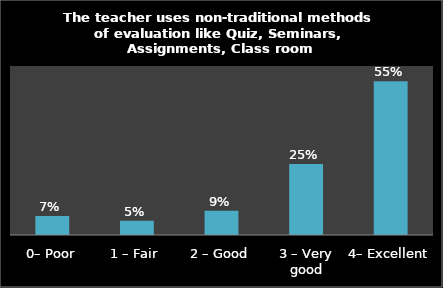
| Category | Series 0 |
|---|---|
| 0– Poor | 0.067 |
| 1 – Fair | 0.051 |
| 2 – Good | 0.086 |
| 3 – Very good | 0.252 |
| 4– Excellent | 0.546 |